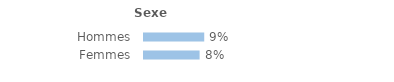
| Category | Series 0 |
|---|---|
| Hommes | 0.09 |
| Femmes | 0.083 |